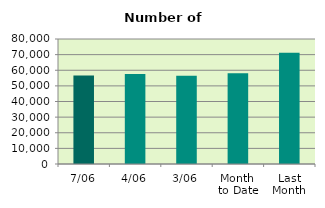
| Category | Series 0 |
|---|---|
| 7/06 | 56658 |
| 4/06 | 57564 |
| 3/06 | 56480 |
| Month 
to Date | 58032.4 |
| Last
Month | 71249.7 |